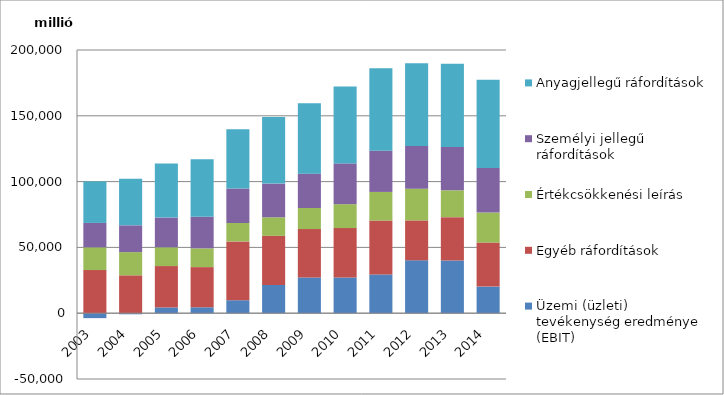
| Category | Üzemi (üzleti) tevékenység eredménye (EBIT) | Egyéb ráfordítások | Értékcsökkenési leírás | Személyi jellegű ráfordítások | Anyagjellegű ráfordítások |
|---|---|---|---|---|---|
| 2003.0 | -3756 | 32786 | 17268 | 18544 | 31533 |
| 2004.0 | -825 | 28787 | 17617 | 20381 | 35433 |
| 2005.0 | 4376 | 31448 | 14269 | 22581 | 41022 |
| 2006.0 | 4489 | 30540 | 14248 | 24013 | 43627 |
| 2007.0 | 9855 | 44682 | 13994 | 26226 | 44958 |
| 2008.0 | 21424 | 37367 | 14107 | 25596 | 50542 |
| 2009.0 | 27160 | 36768 | 16015 | 26117 | 53527 |
| 2010.0 | 27127 | 37559 | 18164 | 30987 | 58334 |
| 2011.0 | 29447 | 40945 | 21754 | 31376 | 62695 |
| 2012.0 | 40185 | 30337 | 24114 | 32467 | 62897 |
| 2013.0 | 40105 | 32889 | 20398 | 32889 | 63230 |
| 2014.0 | 20225 | 33456 | 22825 | 33887 | 67029 |